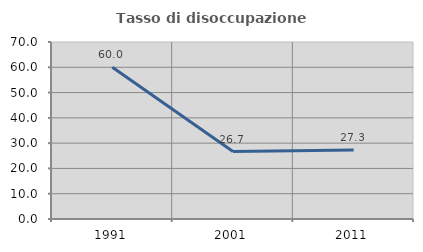
| Category | Tasso di disoccupazione giovanile  |
|---|---|
| 1991.0 | 60 |
| 2001.0 | 26.667 |
| 2011.0 | 27.273 |